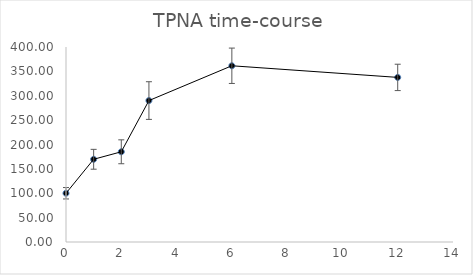
| Category | Series 0 |
|---|---|
| 0.0 | 100 |
| 1.0 | 169.686 |
| 2.0 | 185.053 |
| 3.0 | 290.123 |
| 6.0 | 361.479 |
| 12.0 | 337.64 |